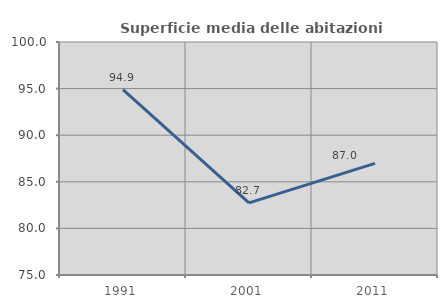
| Category | Superficie media delle abitazioni occupate |
|---|---|
| 1991.0 | 94.902 |
| 2001.0 | 82.734 |
| 2011.0 | 86.977 |